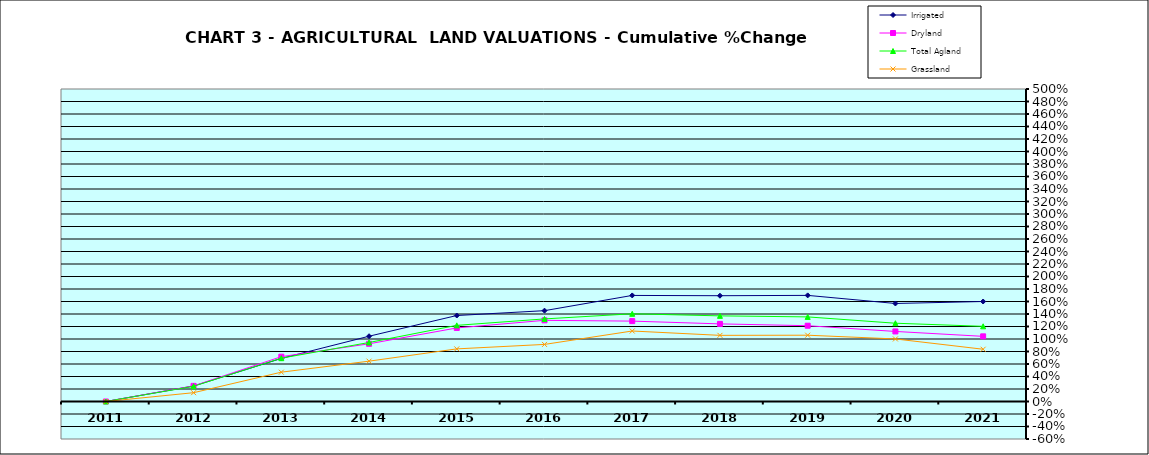
| Category | Irrigated | Dryland | Total Agland | Grassland |
|---|---|---|---|---|
| 2011.0 | 0 | 0 | 0 | 0 |
| 2012.0 | 0.248 | 0.25 | 0.243 | 0.141 |
| 2013.0 | 0.689 | 0.717 | 0.693 | 0.469 |
| 2014.0 | 1.044 | 0.923 | 0.944 | 0.645 |
| 2015.0 | 1.376 | 1.177 | 1.218 | 0.842 |
| 2016.0 | 1.453 | 1.299 | 1.321 | 0.913 |
| 2017.0 | 1.697 | 1.286 | 1.403 | 1.128 |
| 2018.0 | 1.693 | 1.242 | 1.37 | 1.058 |
| 2019.0 | 1.698 | 1.213 | 1.354 | 1.061 |
| 2020.0 | 1.568 | 1.121 | 1.252 | 1.001 |
| 2021.0 | 1.6 | 1.042 | 1.203 | 0.836 |